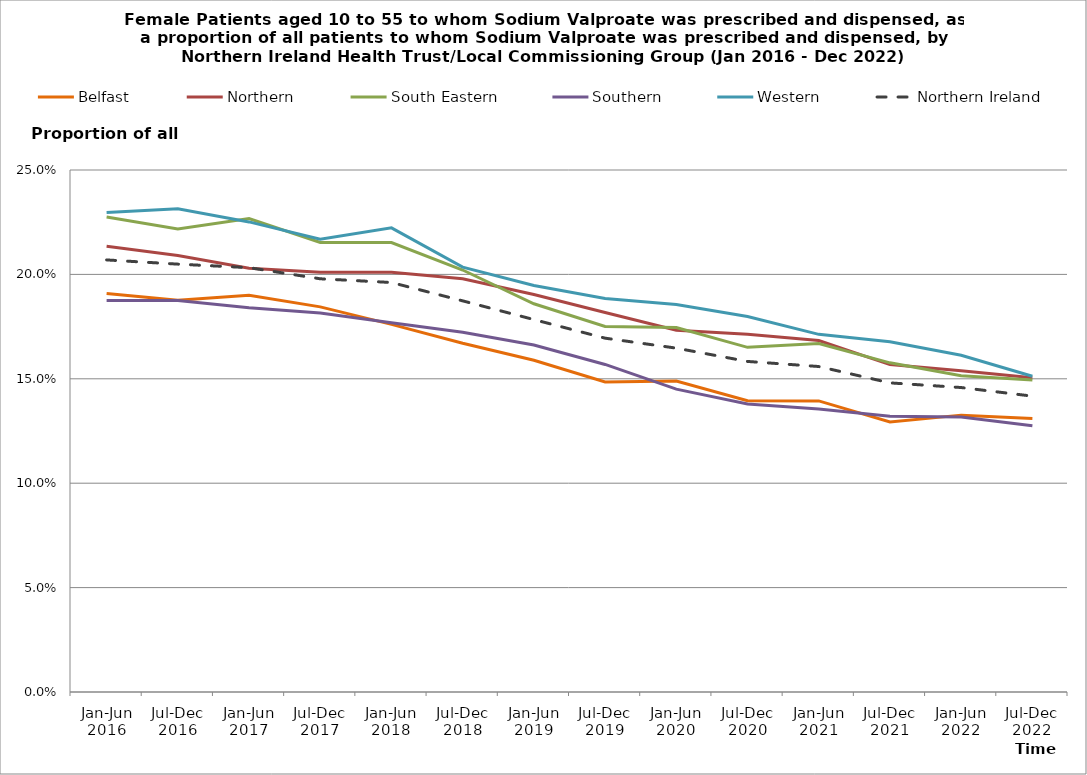
| Category | Belfast | Northern | South Eastern | Southern | Western | Northern Ireland |
|---|---|---|---|---|---|---|
| Jan-Jun 2016 | 0.191 | 0.213 | 0.228 | 0.188 | 0.23 | 0.207 |
| Jul-Dec 2016 | 0.188 | 0.209 | 0.222 | 0.188 | 0.231 | 0.205 |
| Jan-Jun 2017 | 0.19 | 0.203 | 0.227 | 0.184 | 0.225 | 0.203 |
| Jul-Dec 2017 | 0.184 | 0.201 | 0.215 | 0.182 | 0.217 | 0.198 |
| Jan-Jun 2018 | 0.176 | 0.201 | 0.215 | 0.177 | 0.222 | 0.196 |
| Jul-Dec 2018 | 0.167 | 0.198 | 0.202 | 0.172 | 0.203 | 0.187 |
| Jan-Jun 2019 | 0.159 | 0.19 | 0.186 | 0.166 | 0.195 | 0.178 |
| Jul-Dec 2019 | 0.148 | 0.182 | 0.175 | 0.157 | 0.188 | 0.169 |
| Jan-Jun 2020 | 0.149 | 0.173 | 0.175 | 0.145 | 0.186 | 0.165 |
| Jul-Dec 2020 | 0.139 | 0.171 | 0.165 | 0.138 | 0.18 | 0.158 |
| Jan-Jun 2021 | 0.139 | 0.168 | 0.167 | 0.136 | 0.171 | 0.156 |
| Jul-Dec 2021 | 0.129 | 0.157 | 0.158 | 0.132 | 0.168 | 0.148 |
| Jan-Jun 2022 | 0.133 | 0.154 | 0.151 | 0.132 | 0.161 | 0.146 |
| Jul-Dec 2022 | 0.131 | 0.151 | 0.149 | 0.127 | 0.151 | 0.142 |